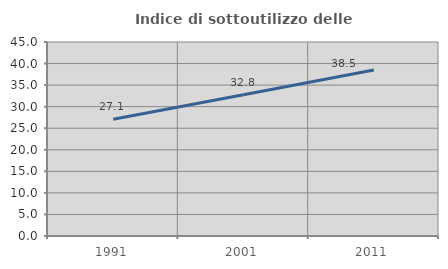
| Category | Indice di sottoutilizzo delle abitazioni  |
|---|---|
| 1991.0 | 27.08 |
| 2001.0 | 32.762 |
| 2011.0 | 38.501 |